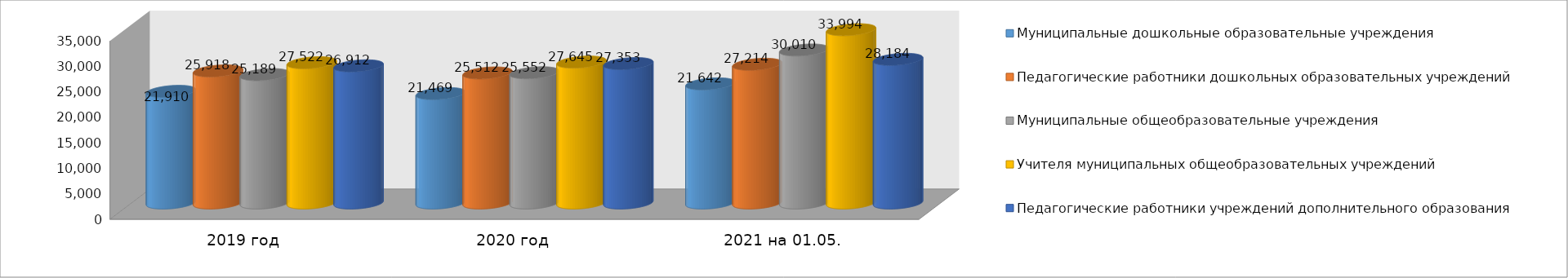
| Category | Муниципальные дошкольные образовательные учреждения | Педагогические работники дошкольных образовательных учреждений | Муниципальные общеобразовательные учреждения | Учителя муниципальных общеобразовательных учреждений | Педагогические работники учреждений дополнительного образования |
|---|---|---|---|---|---|
| 2019 год | 21910 | 25918 | 25189 | 27522 | 26912 |
| 2020 год | 21469 | 25512 | 25552 | 27645 | 27353 |
| 2021 на 01.05. | 23373 | 27214 | 30010 | 33994 | 28184 |